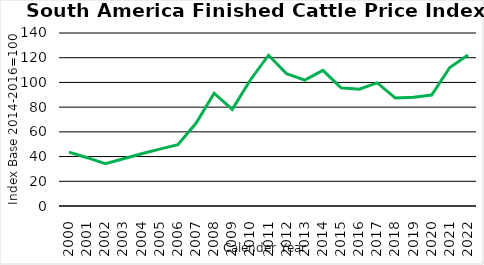
| Category | AR, BR, CO, PE, PY, UY |
|---|---|
| 2000.0 | 43.57 |
| 2001.0 | 39.091 |
| 2002.0 | 34.155 |
| 2003.0 | 38.215 |
| 2004.0 | 42.244 |
| 2005.0 | 46.009 |
| 2006.0 | 49.58 |
| 2007.0 | 66.938 |
| 2008.0 | 91.285 |
| 2009.0 | 78.226 |
| 2010.0 | 101.98 |
| 2011.0 | 122.012 |
| 2012.0 | 107.069 |
| 2013.0 | 101.817 |
| 2014.0 | 109.708 |
| 2015.0 | 95.713 |
| 2016.0 | 94.579 |
| 2017.0 | 99.608 |
| 2018.0 | 87.348 |
| 2019.0 | 88.071 |
| 2020.0 | 89.774 |
| 2021.0 | 112.118 |
| 2022.0 | 122.193 |